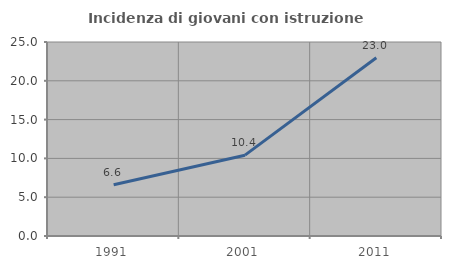
| Category | Incidenza di giovani con istruzione universitaria |
|---|---|
| 1991.0 | 6.604 |
| 2001.0 | 10.417 |
| 2011.0 | 22.973 |